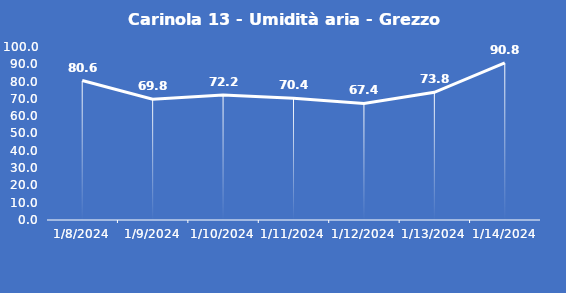
| Category | Carinola 13 - Umidità aria - Grezzo (%) |
|---|---|
| 1/8/24 | 80.6 |
| 1/9/24 | 69.8 |
| 1/10/24 | 72.2 |
| 1/11/24 | 70.4 |
| 1/12/24 | 67.4 |
| 1/13/24 | 73.8 |
| 1/14/24 | 90.8 |